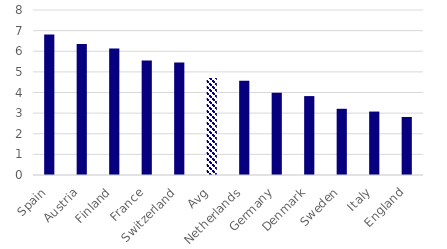
| Category | Series 0 |
|---|---|
| Spain | 6.814 |
| Austria | 6.347 |
| Finland | 6.136 |
| France | 5.55 |
| Switzerland | 5.458 |
| Avg | 4.708 |
| Netherlands | 4.568 |
| Germany | 3.988 |
| Denmark | 3.826 |
| Sweden | 3.21 |
| Italy | 3.076 |
| England | 2.813 |